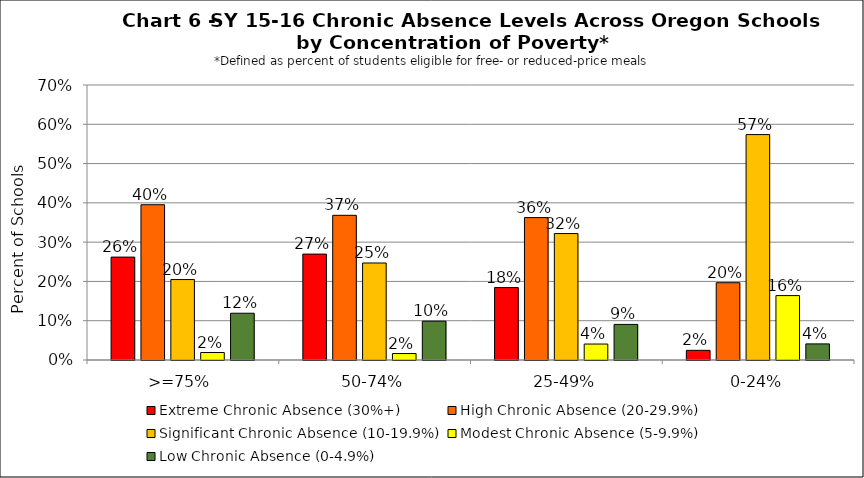
| Category | Extreme Chronic Absence (30%+) | High Chronic Absence (20-29.9%) | Significant Chronic Absence (10-19.9%) | Modest Chronic Absence (5-9.9%) | Low Chronic Absence (0-4.9%) |
|---|---|---|---|---|---|
| 0 | 0.262 | 0.395 | 0.205 | 0.019 | 0.119 |
| 1 | 0.27 | 0.368 | 0.247 | 0.016 | 0.099 |
| 2 | 0.184 | 0.362 | 0.322 | 0.041 | 0.091 |
| 3 | 0.025 | 0.197 | 0.574 | 0.164 | 0.041 |